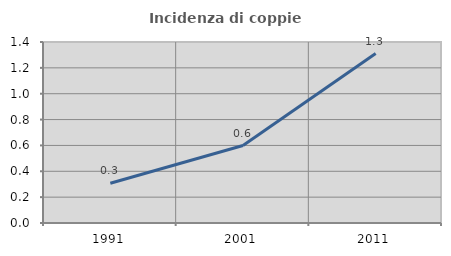
| Category | Incidenza di coppie miste |
|---|---|
| 1991.0 | 0.308 |
| 2001.0 | 0.599 |
| 2011.0 | 1.311 |